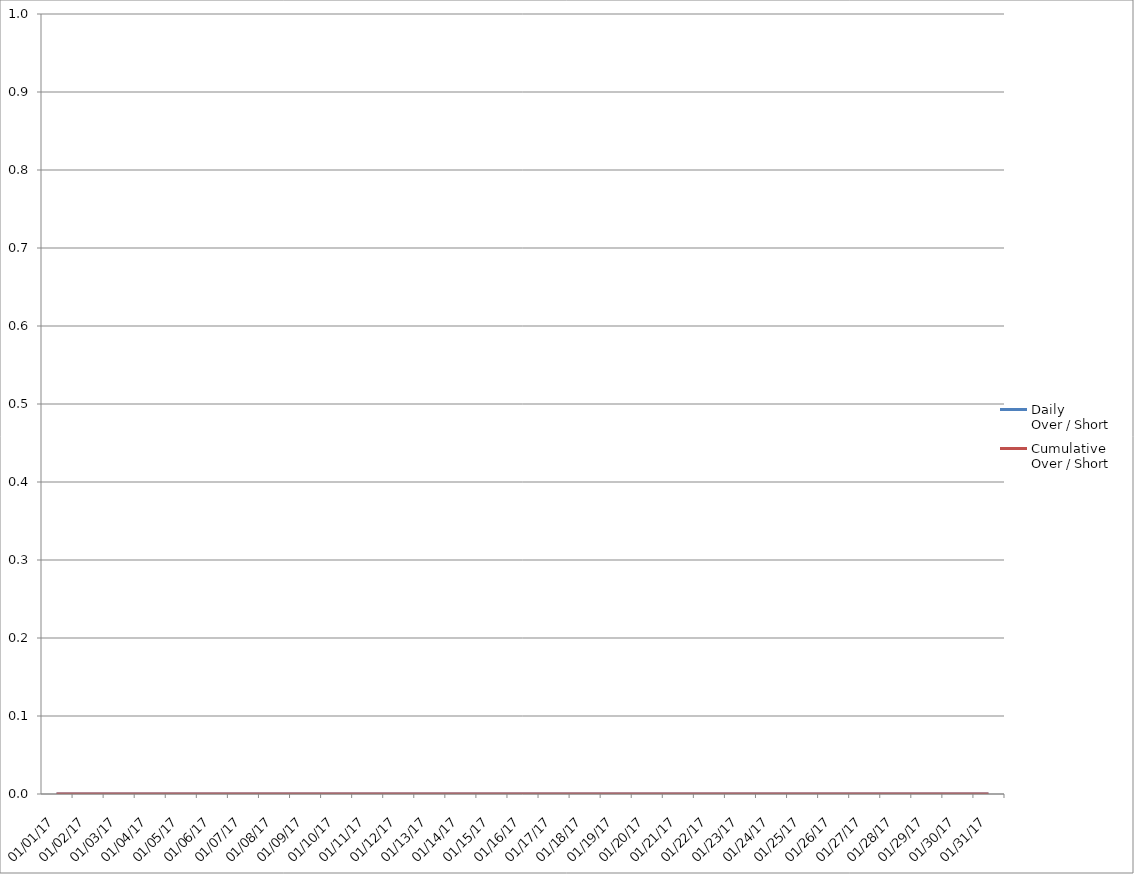
| Category | Daily
Over / Short | Cumulative
Over / Short |
|---|---|---|
| 2017-01-01 | 0 | 0 |
| 2017-01-02 | 0 | 0 |
| 2017-01-03 | 0 | 0 |
| 2017-01-04 | 0 | 0 |
| 2017-01-05 | 0 | 0 |
| 2017-01-06 | 0 | 0 |
| 2017-01-07 | 0 | 0 |
| 2017-01-08 | 0 | 0 |
| 2017-01-09 | 0 | 0 |
| 2017-01-10 | 0 | 0 |
| 2017-01-11 | 0 | 0 |
| 2017-01-12 | 0 | 0 |
| 2017-01-13 | 0 | 0 |
| 2017-01-14 | 0 | 0 |
| 2017-01-15 | 0 | 0 |
| 2017-01-16 | 0 | 0 |
| 2017-01-17 | 0 | 0 |
| 2017-01-18 | 0 | 0 |
| 2017-01-19 | 0 | 0 |
| 2017-01-20 | 0 | 0 |
| 2017-01-21 | 0 | 0 |
| 2017-01-22 | 0 | 0 |
| 2017-01-23 | 0 | 0 |
| 2017-01-24 | 0 | 0 |
| 2017-01-25 | 0 | 0 |
| 2017-01-26 | 0 | 0 |
| 2017-01-27 | 0 | 0 |
| 2017-01-28 | 0 | 0 |
| 2017-01-29 | 0 | 0 |
| 2017-01-30 | 0 | 0 |
| 2017-01-31 | 0 | 0 |